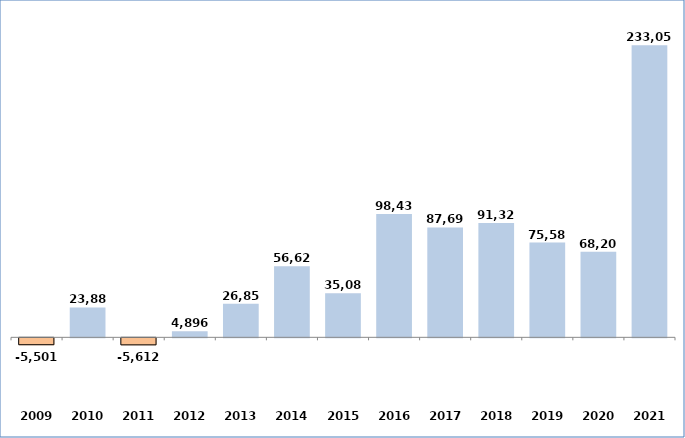
| Category | Series 0 |
|---|---|
| 2009 | -5501.31 |
| 2010 | 23884.34 |
| 2011 | -5612 |
| 2012 | 4895.88 |
| 2013 | 26852.91 |
| 2014 | 56621.86 |
| 2015 | 35085.05 |
| 2016 | 98431.55 |
| 2017 | 87692.32 |
| 2018 | 91322.38 |
| 2019 | 75584 |
| 2020 | 68208 |
| 2021 | 233056.409 |